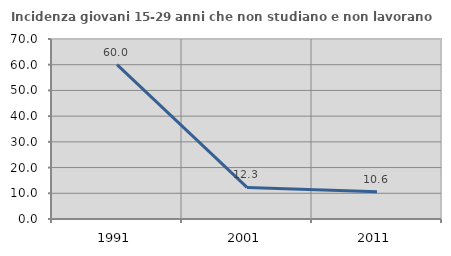
| Category | Incidenza giovani 15-29 anni che non studiano e non lavorano  |
|---|---|
| 1991.0 | 60 |
| 2001.0 | 12.281 |
| 2011.0 | 10.638 |